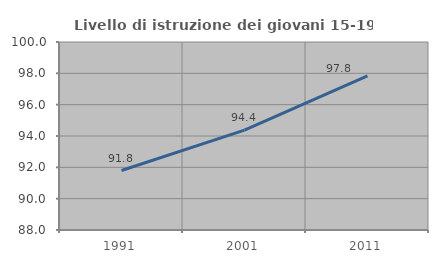
| Category | Livello di istruzione dei giovani 15-19 anni |
|---|---|
| 1991.0 | 91.795 |
| 2001.0 | 94.375 |
| 2011.0 | 97.842 |